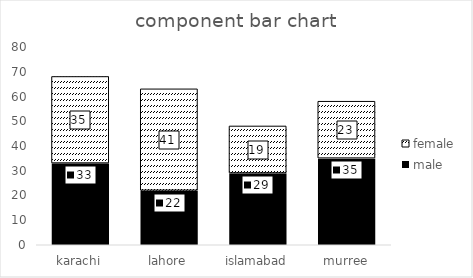
| Category | male | female |
|---|---|---|
| karachi | 33 | 35 |
| lahore | 22 | 41 |
| islamabad | 29 | 19 |
| murree | 35 | 23 |